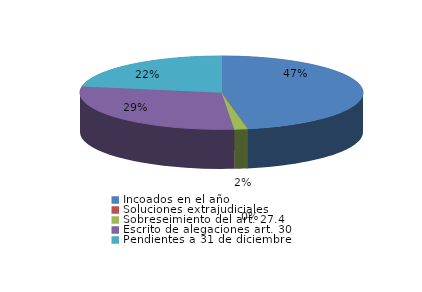
| Category | Series 0 |
|---|---|
| Incoados en el año | 592 |
| Soluciones extrajudiciales | 0 |
| Sobreseimiento del art. 27.4 | 19 |
| Escrito de alegaciones art. 30 | 367 |
| Pendientes a 31 de diciembre | 280 |